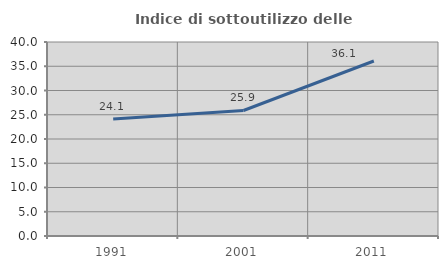
| Category | Indice di sottoutilizzo delle abitazioni  |
|---|---|
| 1991.0 | 24.121 |
| 2001.0 | 25.879 |
| 2011.0 | 36.085 |